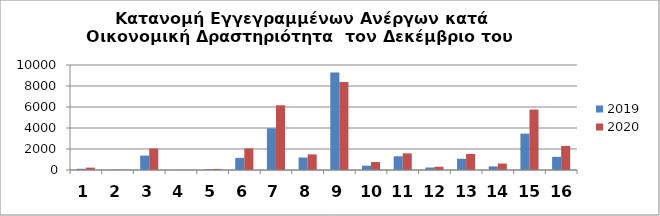
| Category | 2019 | 2020 |
|---|---|---|
| 0 | 116 | 225 |
| 1 | 29 | 42 |
| 2 | 1370 | 2052 |
| 3 | 12 | 15 |
| 4 | 75 | 105 |
| 5 | 1155 | 2060 |
| 6 | 3969 | 6166 |
| 7 | 1190 | 1487 |
| 8 | 9290 | 8383 |
| 9 | 411 | 758 |
| 10 | 1306 | 1589 |
| 11 | 238 | 311 |
| 12 | 1069 | 1526 |
| 13 | 341 | 616 |
| 14 | 3464 | 5754 |
| 15 | 1250 | 2293 |